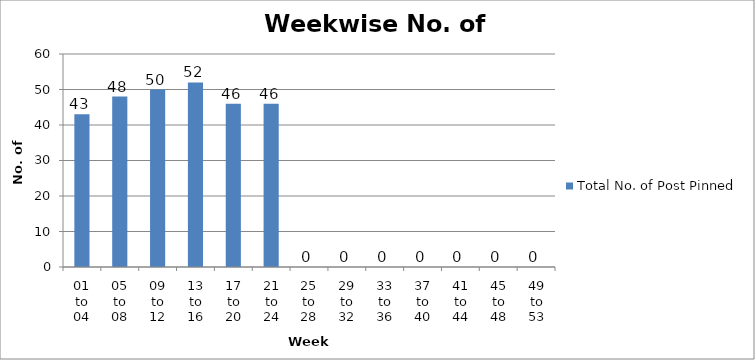
| Category | Total No. of Post Pinned |
|---|---|
| 01 to 04 | 43 |
| 05 to 08 | 48 |
| 09 to 12 | 50 |
| 13 to 16 | 52 |
| 17 to 20 | 46 |
| 21 to 24 | 46 |
| 25 to 28 | 0 |
| 29 to 32 | 0 |
| 33 to 36 | 0 |
| 37 to 40 | 0 |
| 41 to 44 | 0 |
| 45 to 48 | 0 |
| 49 to 53 | 0 |